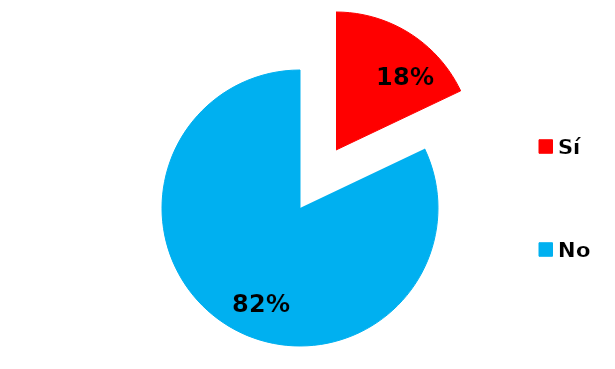
| Category | Series 0 |
|---|---|
| Sí | 7 |
| No | 32 |